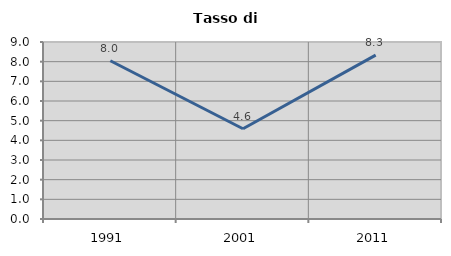
| Category | Tasso di disoccupazione   |
|---|---|
| 1991.0 | 8.046 |
| 2001.0 | 4.591 |
| 2011.0 | 8.333 |